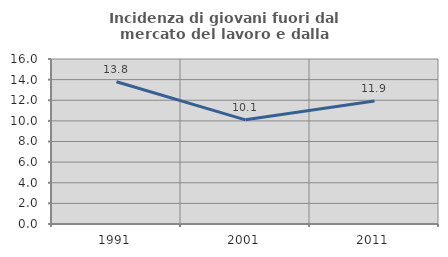
| Category | Incidenza di giovani fuori dal mercato del lavoro e dalla formazione  |
|---|---|
| 1991.0 | 13.793 |
| 2001.0 | 10.101 |
| 2011.0 | 11.927 |